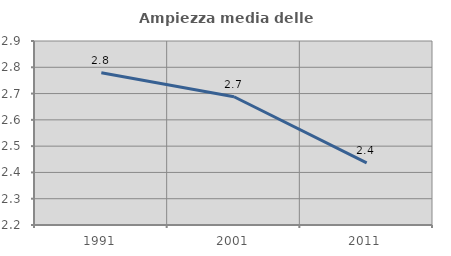
| Category | Ampiezza media delle famiglie |
|---|---|
| 1991.0 | 2.779 |
| 2001.0 | 2.688 |
| 2011.0 | 2.436 |